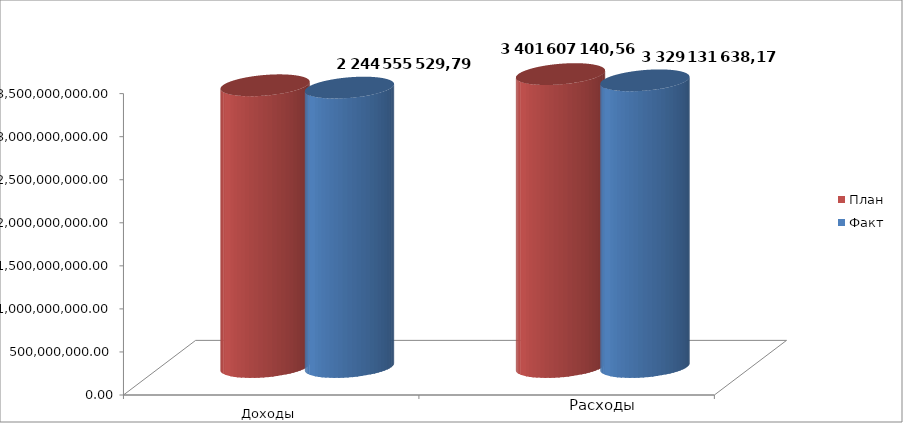
| Category | План | Факт |
|---|---|---|
| 0 | 3271724121.68 | 3244555529.79 |
| 1 | 3401607140.56 | 3329131638.17 |